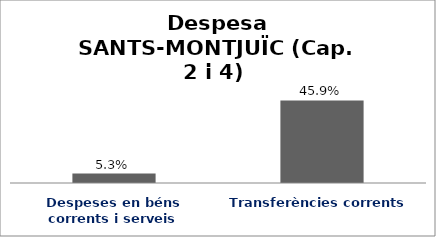
| Category | Series 0 |
|---|---|
| Despeses en béns corrents i serveis | 0.053 |
| Transferències corrents | 0.459 |